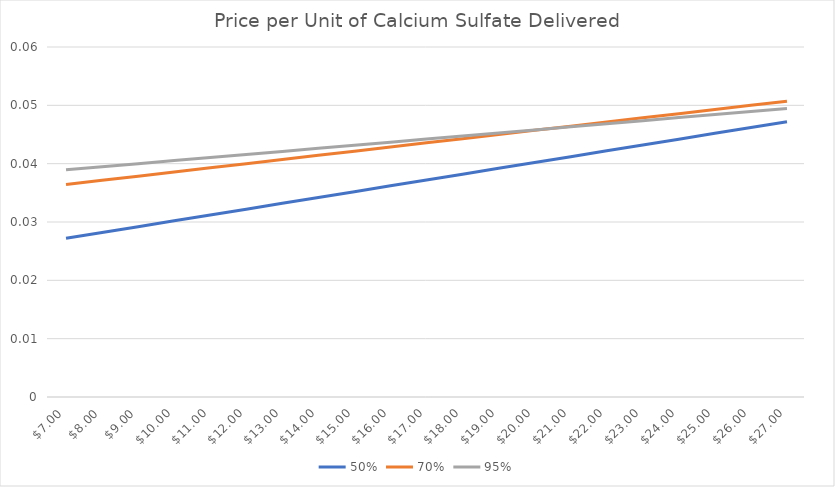
| Category | 50% | 70% | 95% |
|---|---|---|---|
| 7.0 | 0.027 | 0.036 | 0.039 |
| 8.0 | 0.028 | 0.037 | 0.039 |
| 9.0 | 0.029 | 0.038 | 0.04 |
| 10.0 | 0.03 | 0.039 | 0.041 |
| 11.0 | 0.031 | 0.039 | 0.041 |
| 12.0 | 0.032 | 0.04 | 0.042 |
| 13.0 | 0.033 | 0.041 | 0.042 |
| 14.0 | 0.034 | 0.041 | 0.043 |
| 15.0 | 0.035 | 0.042 | 0.043 |
| 16.0 | 0.036 | 0.043 | 0.044 |
| 17.0 | 0.037 | 0.044 | 0.044 |
| 18.0 | 0.038 | 0.044 | 0.045 |
| 19.0 | 0.039 | 0.045 | 0.045 |
| 20.0 | 0.04 | 0.046 | 0.046 |
| 21.0 | 0.041 | 0.046 | 0.046 |
| 22.0 | 0.042 | 0.047 | 0.047 |
| 23.0 | 0.043 | 0.048 | 0.047 |
| 24.0 | 0.044 | 0.049 | 0.048 |
| 25.0 | 0.045 | 0.049 | 0.048 |
| 26.0 | 0.046 | 0.05 | 0.049 |
| 27.0 | 0.047 | 0.051 | 0.049 |